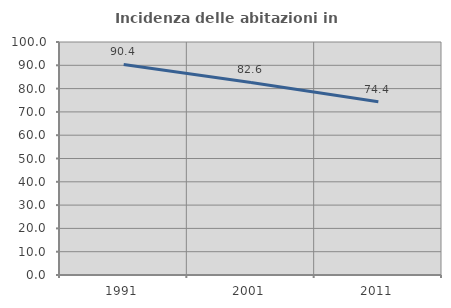
| Category | Incidenza delle abitazioni in proprietà  |
|---|---|
| 1991.0 | 90.38 |
| 2001.0 | 82.634 |
| 2011.0 | 74.394 |